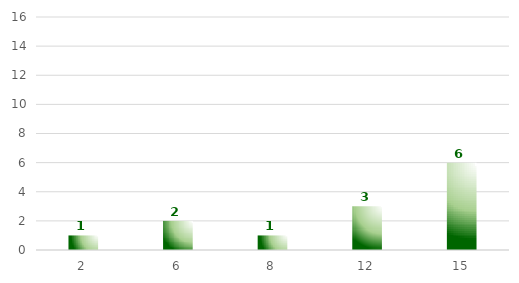
| Category | Series 0 |
|---|---|
| 2.0 | 1 |
| 6.0 | 2 |
| 8.0 | 1 |
| 12.0 | 3 |
| 15.0 | 6 |